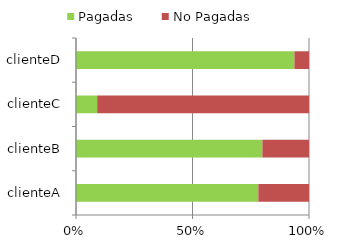
| Category | Pagadas | No Pagadas |
|---|---|---|
| clienteA | 450 | 125 |
| clienteB | 200 | 50 |
| clienteC | 25 | 250 |
| clienteD | 450 | 30 |